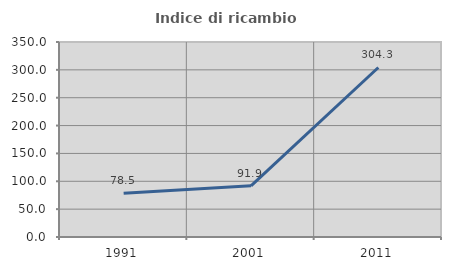
| Category | Indice di ricambio occupazionale  |
|---|---|
| 1991.0 | 78.462 |
| 2001.0 | 91.892 |
| 2011.0 | 304.255 |